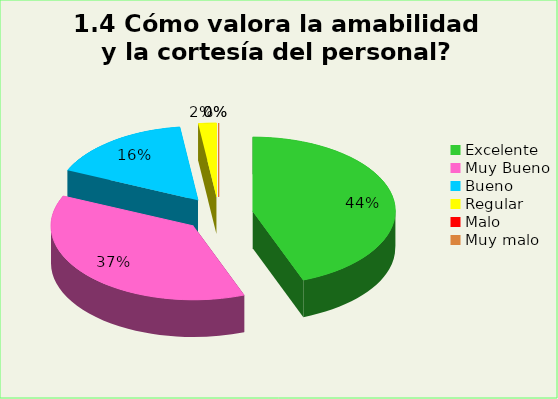
| Category | Series 0 |
|---|---|
| Excelente | 0.442 |
| Muy Bueno | 0.374 |
| Bueno  | 0.163 |
| Regular  | 0.02 |
| Malo  | 0 |
| Muy malo  | 0 |